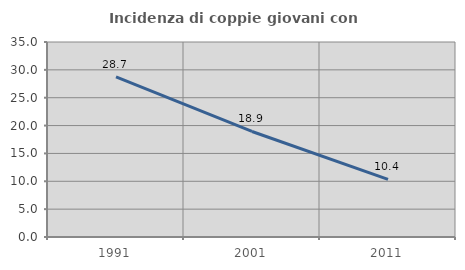
| Category | Incidenza di coppie giovani con figli |
|---|---|
| 1991.0 | 28.73 |
| 2001.0 | 18.94 |
| 2011.0 | 10.351 |